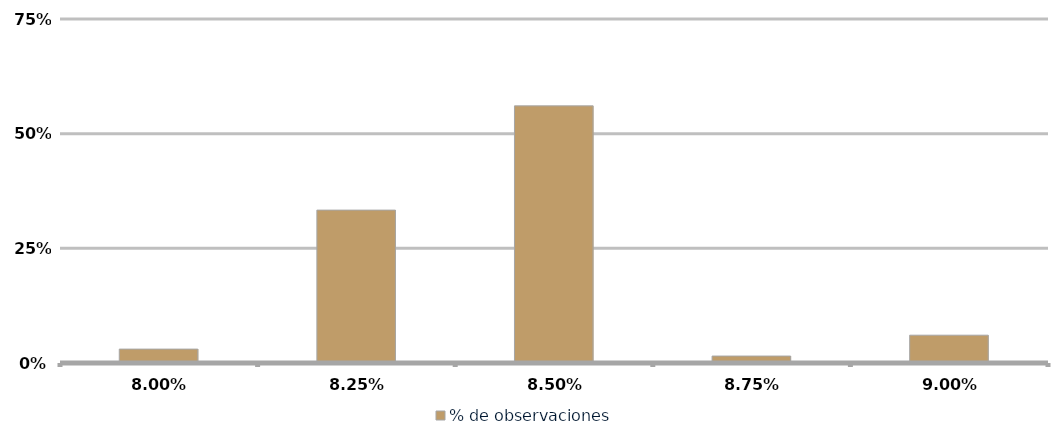
| Category | % de observaciones  |
|---|---|
| 0.08 | 0.03 |
| 0.0825 | 0.333 |
| 0.085 | 0.561 |
| 0.08750000000000001 | 0.015 |
| 0.09000000000000001 | 0.061 |